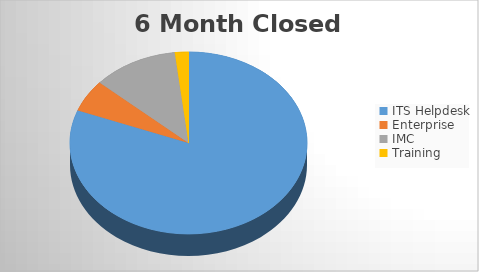
| Category | 6M Closed | 6M Opened |
|---|---|---|
| ITS Helpdesk | 1433 | 1521 |
| Enterprise | 101 | 120 |
| IMC | 206 | 237 |
| Training | 33 | 49 |